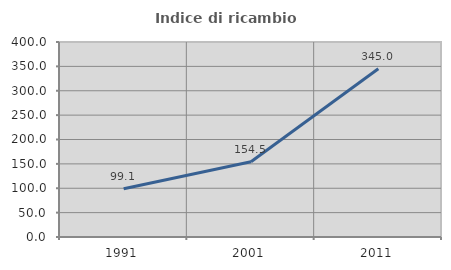
| Category | Indice di ricambio occupazionale  |
|---|---|
| 1991.0 | 99.085 |
| 2001.0 | 154.486 |
| 2011.0 | 345.042 |